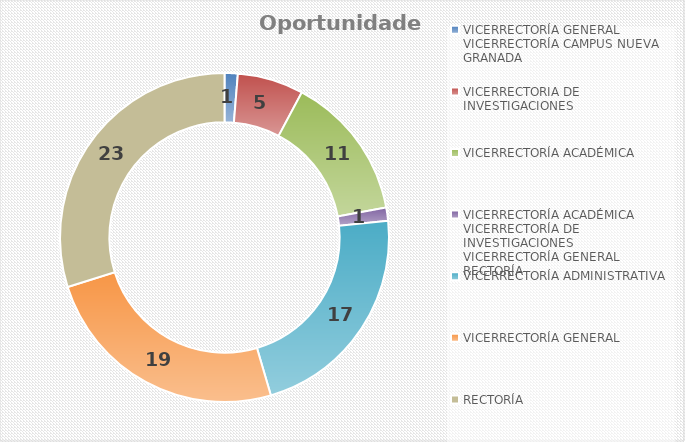
| Category | Oportunidades |
|---|---|
| VICERRECTORÍA GENERAL
VICERRECTORÍA CAMPUS NUEVA GRANADA | 1 |
| VICERRECTORIA DE INVESTIGACIONES | 5 |
| VICERRECTORÍA ACADÉMICA | 11 |
| VICERRECTORÍA ACADÉMICA
VICERRECTORÍA DE INVESTIGACIONES
VICERRECTORÍA GENERAL
RECTORÍA


 | 1 |
| VICERRECTORÍA ADMINISTRATIVA | 17 |
| VICERRECTORÍA GENERAL | 19 |
| RECTORÍA | 23 |